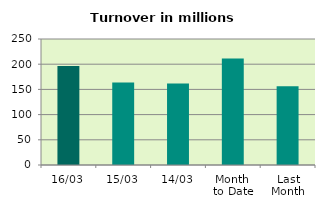
| Category | Series 0 |
|---|---|
| 16/03 | 196.554 |
| 15/03 | 163.688 |
| 14/03 | 161.646 |
| Month 
to Date | 211.173 |
| Last
Month | 156.222 |